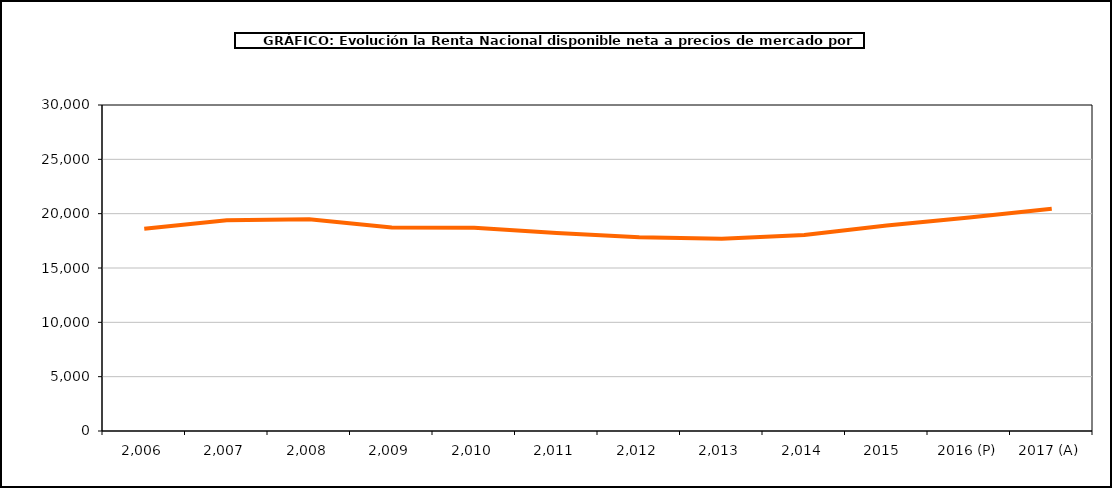
| Category | Renta por habitante |
|---|---|
| 2,006 | 18614.231 |
| 2,007 | 19403.217 |
| 2,008 | 19492.197 |
| 2,009 | 18719.773 |
| 2,010 | 18706.842 |
| 2,011 | 18229.616 |
| 2,012 | 17822.82 |
| 2,013 | 17692.357 |
| 2,014 | 18039.845 |
| 2015  | 18919.091 |
| 2016 (P) | 19645.016 |
| 2017 (A) | 20456.526 |